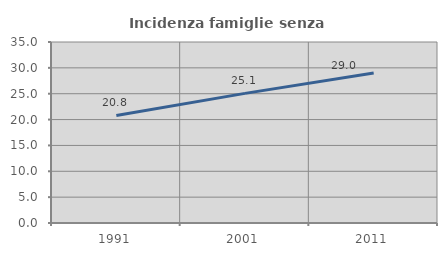
| Category | Incidenza famiglie senza nuclei |
|---|---|
| 1991.0 | 20.788 |
| 2001.0 | 25.068 |
| 2011.0 | 29.012 |